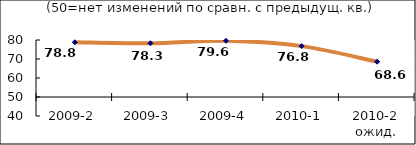
| Category | Диф.индекс ↓ |
|---|---|
| 2009-2 | 78.795 |
| 2009-3 | 78.28 |
| 2009-4 | 79.6 |
| 2010-1 | 76.775 |
| 2010-2 ожид. | 68.58 |